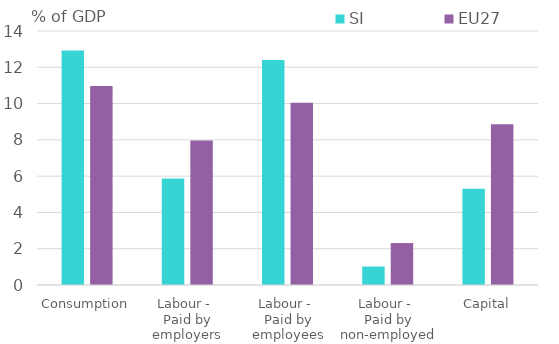
| Category | SI | EU27 |
|---|---|---|
| Consumption | 12.928 | 10.967 |
| Labour - 
Paid by employers | 5.87 | 7.966 |
| Labour - 
Paid by employees | 12.406 | 10.052 |
| Labour - 
Paid by non-employed | 1.018 | 2.311 |
| Capital | 5.305 | 8.858 |